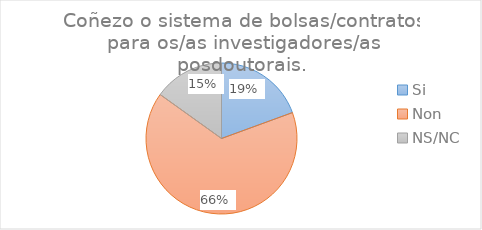
| Category | Series 25 |
|---|---|
| Si | 27 |
| Non | 91 |
| NS/NC | 21 |